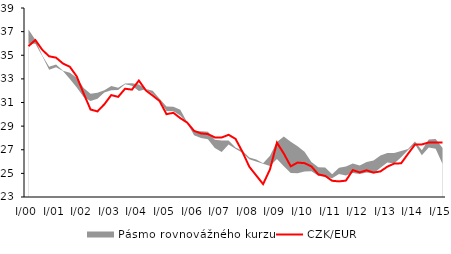
| Category | CZK/EUR  |
|---|---|
| I/00 | 35.771 |
| II | 36.289 |
| III | 35.459 |
| IV | 34.911 |
| I/01 | 34.798 |
| II | 34.298 |
| III | 34.024 |
| IV | 33.202 |
| I/02 | 31.756 |
| II | 30.405 |
| III | 30.247 |
| IV | 30.853 |
| I/03 | 31.628 |
| II | 31.477 |
| III | 32.167 |
| IV | 32.089 |
| I/04 | 32.859 |
| II | 32.027 |
| III | 31.587 |
| IV | 31.126 |
| I/05 | 30.014 |
| II | 30.126 |
| III | 29.677 |
| IV | 29.298 |
| I/06 | 28.6 |
| II | 28.384 |
| III | 28.33 |
| IV | 28.045 |
| I/07 | 28.037 |
| II | 28.266 |
| III | 27.923 |
| IV | 26.829 |
| I/08 | 25.562 |
| II | 24.826 |
| III | 24.092 |
| IV | 25.342 |
| I/09 | 27.599 |
| II | 26.677 |
| III | 25.598 |
| IV | 25.915 |
| I/10 | 25.868 |
| II | 25.589 |
| III | 24.913 |
| IV | 24.786 |
| I/11 | 24.375 |
| II | 24.321 |
| III | 24.388 |
| IV | 25.279 |
| I/12 | 25.083 |
| II | 25.261 |
| III | 25.065 |
| IV | 25.167 |
| I/13 | 25.568 |
| II | 25.831 |
| III | 25.852 |
| IV | 26.657 |
| I/14 | 27.441 |
| II | 27.447 |
| III | 27.618 |
| IV | 27.624 |
| I/15 | 27.624 |